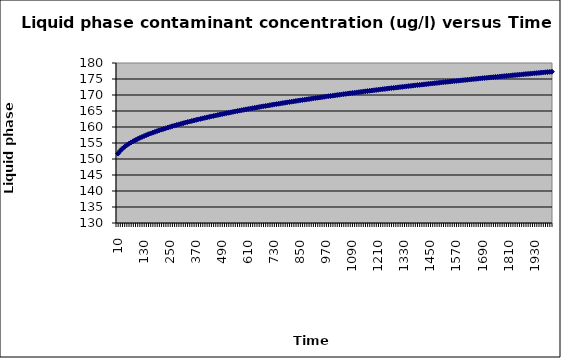
| Category | Series 0 |
|---|---|
| 10.0 | 151.695 |
| 20.0 | 152.577 |
| 30.0 | 153.251 |
| 40.0 | 153.817 |
| 50.0 | 154.314 |
| 60.0 | 154.763 |
| 70.0 | 155.174 |
| 80.0 | 155.557 |
| 90.0 | 155.915 |
| 100.0 | 156.253 |
| 110.0 | 156.574 |
| 120.0 | 156.88 |
| 130.0 | 157.173 |
| 140.0 | 157.454 |
| 150.0 | 157.725 |
| 160.0 | 157.987 |
| 170.0 | 158.24 |
| 180.0 | 158.486 |
| 190.0 | 158.724 |
| 200.0 | 158.956 |
| 210.0 | 159.182 |
| 220.0 | 159.402 |
| 230.0 | 159.617 |
| 240.0 | 159.827 |
| 250.0 | 160.032 |
| 260.0 | 160.233 |
| 270.0 | 160.43 |
| 280.0 | 160.623 |
| 290.0 | 160.812 |
| 300.0 | 160.998 |
| 310.0 | 161.181 |
| 320.0 | 161.36 |
| 330.0 | 161.537 |
| 340.0 | 161.71 |
| 350.0 | 161.881 |
| 360.0 | 162.049 |
| 370.0 | 162.214 |
| 380.0 | 162.378 |
| 390.0 | 162.538 |
| 400.0 | 162.697 |
| 410.0 | 162.853 |
| 420.0 | 163.008 |
| 430.0 | 163.16 |
| 440.0 | 163.31 |
| 450.0 | 163.459 |
| 460.0 | 163.606 |
| 470.0 | 163.751 |
| 480.0 | 163.894 |
| 490.0 | 164.035 |
| 500.0 | 164.175 |
| 510.0 | 164.314 |
| 520.0 | 164.451 |
| 530.0 | 164.586 |
| 540.0 | 164.72 |
| 550.0 | 164.853 |
| 560.0 | 164.984 |
| 570.0 | 165.114 |
| 580.0 | 165.243 |
| 590.0 | 165.371 |
| 600.0 | 165.497 |
| 610.0 | 165.622 |
| 620.0 | 165.746 |
| 630.0 | 165.869 |
| 640.0 | 165.99 |
| 650.0 | 166.111 |
| 660.0 | 166.231 |
| 670.0 | 166.349 |
| 680.0 | 166.467 |
| 690.0 | 166.583 |
| 700.0 | 166.699 |
| 710.0 | 166.814 |
| 720.0 | 166.927 |
| 730.0 | 167.04 |
| 740.0 | 167.152 |
| 750.0 | 167.263 |
| 760.0 | 167.373 |
| 770.0 | 167.483 |
| 780.0 | 167.591 |
| 790.0 | 167.699 |
| 800.0 | 167.806 |
| 810.0 | 167.912 |
| 820.0 | 168.018 |
| 830.0 | 168.123 |
| 840.0 | 168.227 |
| 850.0 | 168.33 |
| 860.0 | 168.432 |
| 870.0 | 168.534 |
| 880.0 | 168.635 |
| 890.0 | 168.736 |
| 900.0 | 168.836 |
| 910.0 | 168.935 |
| 920.0 | 169.033 |
| 930.0 | 169.131 |
| 940.0 | 169.229 |
| 950.0 | 169.325 |
| 960.0 | 169.421 |
| 970.0 | 169.517 |
| 980.0 | 169.612 |
| 990.0 | 169.706 |
| 1000.0 | 169.8 |
| 1010.0 | 169.893 |
| 1020.0 | 169.986 |
| 1030.0 | 170.078 |
| 1040.0 | 170.17 |
| 1050.0 | 170.261 |
| 1060.0 | 170.351 |
| 1070.0 | 170.441 |
| 1080.0 | 170.531 |
| 1090.0 | 170.62 |
| 1100.0 | 170.708 |
| 1110.0 | 170.796 |
| 1120.0 | 170.884 |
| 1130.0 | 170.971 |
| 1140.0 | 171.058 |
| 1150.0 | 171.144 |
| 1160.0 | 171.23 |
| 1170.0 | 171.315 |
| 1180.0 | 171.4 |
| 1190.0 | 171.484 |
| 1200.0 | 171.568 |
| 1210.0 | 171.652 |
| 1220.0 | 171.735 |
| 1230.0 | 171.817 |
| 1240.0 | 171.9 |
| 1250.0 | 171.982 |
| 1260.0 | 172.063 |
| 1270.0 | 172.144 |
| 1280.0 | 172.225 |
| 1290.0 | 172.305 |
| 1300.0 | 172.385 |
| 1310.0 | 172.465 |
| 1320.0 | 172.544 |
| 1330.0 | 172.622 |
| 1340.0 | 172.701 |
| 1350.0 | 172.779 |
| 1360.0 | 172.857 |
| 1370.0 | 172.934 |
| 1380.0 | 173.011 |
| 1390.0 | 173.088 |
| 1400.0 | 173.164 |
| 1410.0 | 173.24 |
| 1420.0 | 173.316 |
| 1430.0 | 173.391 |
| 1440.0 | 173.466 |
| 1450.0 | 173.54 |
| 1460.0 | 173.615 |
| 1470.0 | 173.689 |
| 1480.0 | 173.762 |
| 1490.0 | 173.836 |
| 1500.0 | 173.909 |
| 1510.0 | 173.982 |
| 1520.0 | 174.054 |
| 1530.0 | 174.126 |
| 1540.0 | 174.198 |
| 1550.0 | 174.27 |
| 1560.0 | 174.341 |
| 1570.0 | 174.412 |
| 1580.0 | 174.482 |
| 1590.0 | 174.553 |
| 1600.0 | 174.623 |
| 1610.0 | 174.693 |
| 1620.0 | 174.762 |
| 1630.0 | 174.832 |
| 1640.0 | 174.901 |
| 1650.0 | 174.969 |
| 1660.0 | 175.038 |
| 1670.0 | 175.106 |
| 1680.0 | 175.174 |
| 1690.0 | 175.241 |
| 1700.0 | 175.309 |
| 1710.0 | 175.376 |
| 1720.0 | 175.443 |
| 1730.0 | 175.51 |
| 1740.0 | 175.576 |
| 1750.0 | 175.642 |
| 1760.0 | 175.708 |
| 1770.0 | 175.774 |
| 1780.0 | 175.839 |
| 1790.0 | 175.904 |
| 1800.0 | 175.969 |
| 1810.0 | 176.034 |
| 1820.0 | 176.098 |
| 1830.0 | 176.163 |
| 1840.0 | 176.227 |
| 1850.0 | 176.29 |
| 1860.0 | 176.354 |
| 1870.0 | 176.417 |
| 1880.0 | 176.48 |
| 1890.0 | 176.543 |
| 1900.0 | 176.606 |
| 1910.0 | 176.668 |
| 1920.0 | 176.73 |
| 1930.0 | 176.792 |
| 1940.0 | 176.854 |
| 1950.0 | 176.916 |
| 1960.0 | 176.977 |
| 1970.0 | 177.038 |
| 1980.0 | 177.099 |
| 1990.0 | 177.16 |
| 2000.0 | 177.221 |
| 2010.0 | 177.281 |